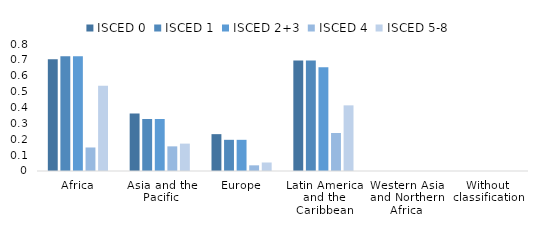
| Category | ISCED 0 | ISCED 1 | ISCED 2+3 | ISCED 4 | ISCED 5-8 |
|---|---|---|---|---|---|
| Africa | 0.704 | 0.722 | 0.722 | 0.148 | 0.537 |
| Asia and the Pacific | 0.362 | 0.328 | 0.328 | 0.155 | 0.172 |
| Europe | 0.232 | 0.196 | 0.196 | 0.036 | 0.054 |
| Latin America and the Caribbean | 0.696 | 0.696 | 0.653 | 0.239 | 0.414 |
| Western Asia and Northern Africa | 0 | 0 | 0 | 0 | 0 |
| Without classification | 0 | 0 | 0 | 0 | 0 |